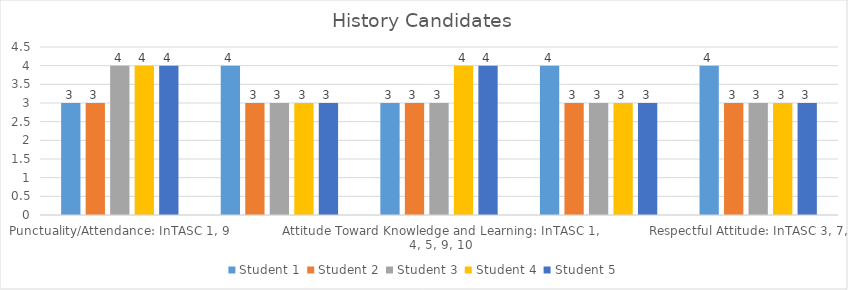
| Category | Student 1 | Student 2 | Student 3 | Student 4 | Student 5 |
|---|---|---|---|---|---|
| Punctuality/Attendance: InTASC 1, 9 | 3 | 3 | 4 | 4 | 4 |
| Interactions with Others: InTASC 3, 7, 10 | 4 | 3 | 3 | 3 | 3 |
| Attitude Toward Knowledge and Learning: InTASC 1, 4, 5, 9, 10 | 3 | 3 | 3 | 4 | 4 |
| Patience: InTASC 3, 10 | 4 | 3 | 3 | 3 | 3 |
| Respectful Attitude: InTASC 3, 7, 10 | 4 | 3 | 3 | 3 | 3 |